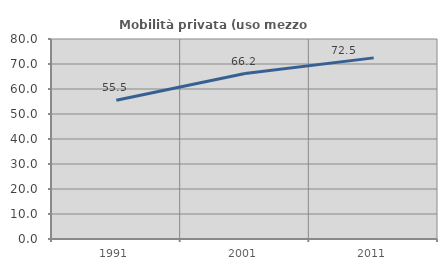
| Category | Mobilità privata (uso mezzo privato) |
|---|---|
| 1991.0 | 55.532 |
| 2001.0 | 66.181 |
| 2011.0 | 72.453 |